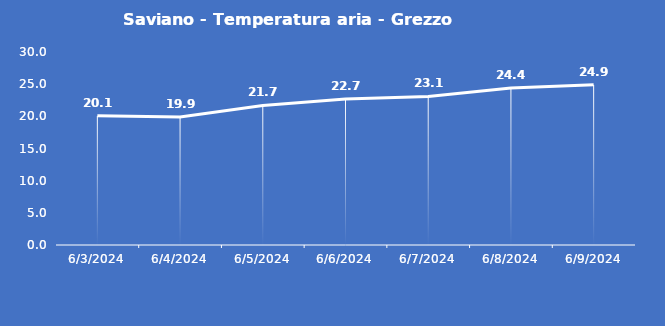
| Category | Saviano - Temperatura aria - Grezzo (°C) |
|---|---|
| 6/3/24 | 20.1 |
| 6/4/24 | 19.9 |
| 6/5/24 | 21.7 |
| 6/6/24 | 22.7 |
| 6/7/24 | 23.1 |
| 6/8/24 | 24.4 |
| 6/9/24 | 24.9 |